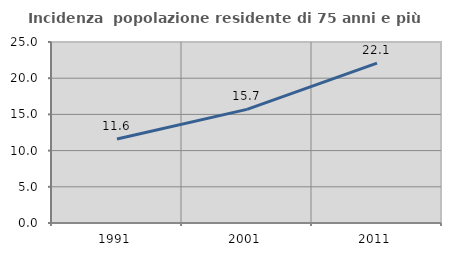
| Category | Incidenza  popolazione residente di 75 anni e più |
|---|---|
| 1991.0 | 11.593 |
| 2001.0 | 15.699 |
| 2011.0 | 22.093 |